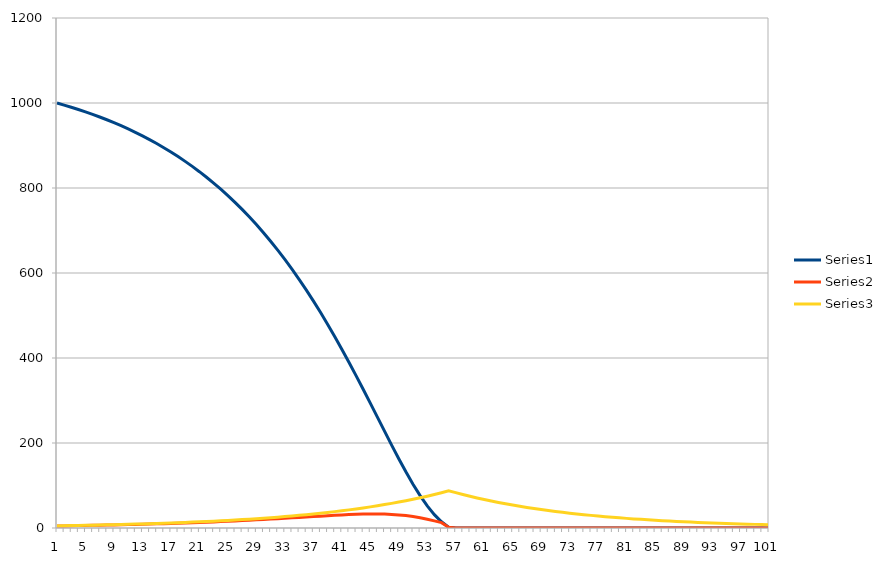
| Category | Series 0 | Series 1 | Series 2 |
|---|---|---|---|
| 0 | 1000 | 5 | 5 |
| 1 | 995 | 5 | 5.5 |
| 2 | 990 | 5.304 | 5.8 |
| 3 | 984.696 | 5.59 | 6.105 |
| 4 | 979.107 | 5.88 | 6.426 |
| 5 | 973.227 | 6.184 | 6.763 |
| 6 | 967.042 | 6.504 | 7.118 |
| 7 | 960.538 | 6.84 | 7.491 |
| 8 | 953.698 | 7.193 | 7.885 |
| 9 | 946.505 | 7.564 | 8.299 |
| 10 | 938.941 | 7.953 | 8.734 |
| 11 | 930.988 | 8.362 | 9.193 |
| 12 | 922.626 | 8.791 | 9.675 |
| 13 | 913.835 | 9.241 | 10.183 |
| 14 | 904.595 | 9.713 | 10.718 |
| 15 | 894.882 | 10.208 | 11.28 |
| 16 | 884.673 | 10.727 | 11.872 |
| 17 | 873.946 | 11.271 | 12.496 |
| 18 | 862.675 | 11.841 | 13.152 |
| 19 | 850.834 | 12.437 | 13.842 |
| 20 | 838.396 | 13.062 | 14.569 |
| 21 | 825.335 | 13.714 | 15.333 |
| 22 | 811.621 | 14.396 | 16.138 |
| 23 | 797.225 | 15.108 | 16.985 |
| 24 | 782.117 | 15.85 | 17.877 |
| 25 | 766.267 | 16.623 | 18.816 |
| 26 | 749.643 | 17.428 | 19.803 |
| 27 | 732.215 | 18.264 | 20.843 |
| 28 | 713.952 | 19.13 | 21.937 |
| 29 | 694.822 | 20.026 | 23.088 |
| 30 | 674.796 | 20.951 | 24.3 |
| 31 | 653.845 | 21.903 | 25.576 |
| 32 | 631.942 | 22.879 | 26.919 |
| 33 | 609.063 | 23.874 | 28.332 |
| 34 | 585.189 | 24.885 | 29.819 |
| 35 | 560.304 | 25.904 | 31.384 |
| 36 | 534.4 | 26.922 | 33.032 |
| 37 | 507.479 | 27.929 | 34.766 |
| 38 | 479.55 | 28.911 | 36.591 |
| 39 | 450.639 | 29.85 | 38.512 |
| 40 | 420.789 | 30.725 | 40.533 |
| 41 | 390.064 | 31.508 | 42.661 |
| 42 | 358.556 | 32.168 | 44.9 |
| 43 | 326.388 | 32.666 | 47.257 |
| 44 | 293.722 | 32.955 | 49.738 |
| 45 | 260.767 | 32.981 | 52.349 |
| 46 | 227.785 | 32.684 | 55.097 |
| 47 | 195.102 | 31.996 | 57.989 |
| 48 | 163.106 | 30.85 | 61.033 |
| 49 | 132.256 | 29.182 | 64.237 |
| 50 | 103.074 | 26.941 | 67.609 |
| 51 | 76.133 | 24.104 | 71.158 |
| 52 | 52.029 | 20.691 | 74.894 |
| 53 | 31.339 | 16.786 | 78.825 |
| 54 | 14.552 | 12.551 | 82.963 |
| 55 | 2.001 | 2.001 | 87.318 |
| 56 | 0 | 0 | 83.17 |
| 57 | 0 | 0 | 78.804 |
| 58 | 0 | 0 | 74.645 |
| 59 | 0 | 0 | 70.705 |
| 60 | 0 | 0 | 66.973 |
| 61 | 0 | 0 | 63.438 |
| 62 | 0 | 0 | 60.089 |
| 63 | 0 | 0 | 56.917 |
| 64 | 0 | 0 | 53.913 |
| 65 | 0 | 0 | 51.067 |
| 66 | 0 | 0 | 48.371 |
| 67 | 0 | 0 | 45.818 |
| 68 | 0 | 0 | 43.399 |
| 69 | 0 | 0 | 41.108 |
| 70 | 0 | 0 | 38.938 |
| 71 | 0 | 0 | 36.883 |
| 72 | 0 | 0 | 34.936 |
| 73 | 0 | 0 | 33.092 |
| 74 | 0 | 0 | 31.345 |
| 75 | 0 | 0 | 29.691 |
| 76 | 0 | 0 | 28.123 |
| 77 | 0 | 0 | 26.639 |
| 78 | 0 | 0 | 25.233 |
| 79 | 0 | 0 | 23.901 |
| 80 | 0 | 0 | 22.639 |
| 81 | 0 | 0 | 21.444 |
| 82 | 0 | 0 | 20.312 |
| 83 | 0 | 0 | 19.24 |
| 84 | 0 | 0 | 18.224 |
| 85 | 0 | 0 | 17.262 |
| 86 | 0 | 0 | 16.351 |
| 87 | 0 | 0 | 15.488 |
| 88 | 0 | 0 | 14.67 |
| 89 | 0 | 0 | 13.896 |
| 90 | 0 | 0 | 13.162 |
| 91 | 0 | 0 | 12.468 |
| 92 | 0 | 0 | 11.81 |
| 93 | 0 | 0 | 11.186 |
| 94 | 0 | 0 | 10.596 |
| 95 | 0 | 0 | 10.036 |
| 96 | 0 | 0 | 9.507 |
| 97 | 0 | 0 | 9.005 |
| 98 | 0 | 0 | 8.529 |
| 99 | 0 | 0 | 8.079 |
| 100 | 0 | 0 | 7.653 |